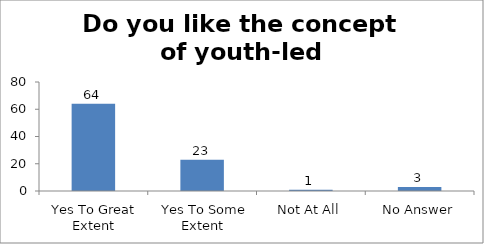
| Category | Do you like the concept of youth-led changemaking?  |
|---|---|
| Yes To Great Extent | 64 |
|  Yes To Some Extent | 23 |
| Not At All | 1 |
| No Answer | 3 |